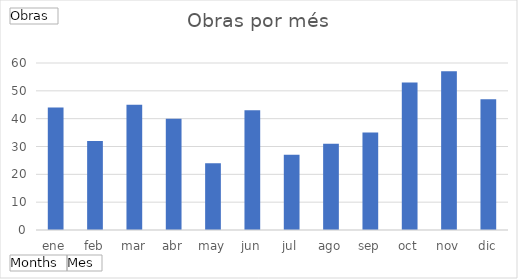
| Category | Total |
|---|---|
| ene | 44 |
| feb | 32 |
| mar | 45 |
| abr | 40 |
| may | 24 |
| jun | 43 |
| jul | 27 |
| ago | 31 |
| sep | 35 |
| oct | 53 |
| nov | 57 |
| dic | 47 |